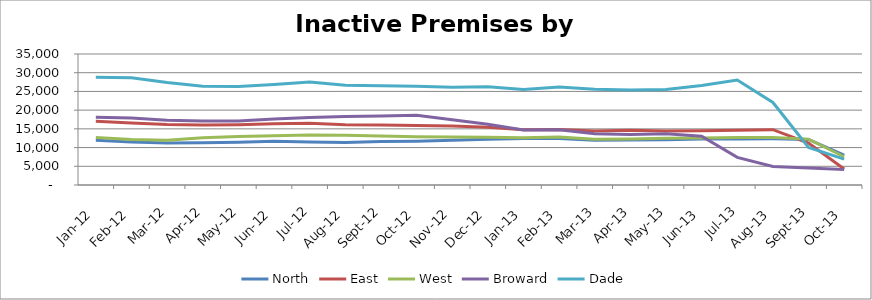
| Category | North | East | West | Broward | Dade |
|---|---|---|---|---|---|
| 2012-01-01 | 11938 | 17065 | 12717 | 18110 | 28771 |
| 2012-02-01 | 11457 | 16564 | 12184 | 17886 | 28650 |
| 2012-03-01 | 11247 | 16152 | 11937 | 17303 | 27378 |
| 2012-04-01 | 11265 | 16006 | 12629 | 17066 | 26410 |
| 2012-05-01 | 11432 | 16089 | 12983 | 17103 | 26338 |
| 2012-06-01 | 11684 | 16340 | 13137 | 17635 | 26875 |
| 2012-07-01 | 11509 | 16469 | 13359 | 18065 | 27540 |
| 2012-08-01 | 11370 | 16111 | 13285 | 18274 | 26683 |
| 2012-09-01 | 11591 | 16030 | 13104 | 18460 | 26505 |
| 2012-10-01 | 11707 | 15919 | 12910 | 18659 | 26413 |
| 2012-11-01 | 11987 | 15748 | 12814 | 17449 | 26085 |
| 2012-12-01 | 12246 | 15429 | 12780 | 16227 | 26261 |
| 2013-01-01 | 12396 | 14764 | 12622 | 14725 | 25520 |
| 2013-02-01 | 12426 | 14848 | 12805 | 14759 | 26156 |
| 2013-03-01 | 11988 | 14455 | 12228 | 13692 | 25604 |
| 2013-04-01 | 11992 | 14604 | 12296 | 13472 | 25366 |
| 2013-05-01 | 12094 | 14411 | 12496 | 13708 | 25497 |
| 2013-06-01 | 12271 | 14486 | 12536 | 13021 | 26579 |
| 2013-07-01 | 12303 | 14622 | 12714 | 7381 | 28040 |
| 2013-08-01 | 12333 | 14770 | 12690 | 4936 | 22052 |
| 2013-09-01 | 12189 | 11205 | 12258 | 4543 | 10009 |
| 2013-10-01 | 7987 | 4258 | 7551 | 4119 | 6913 |